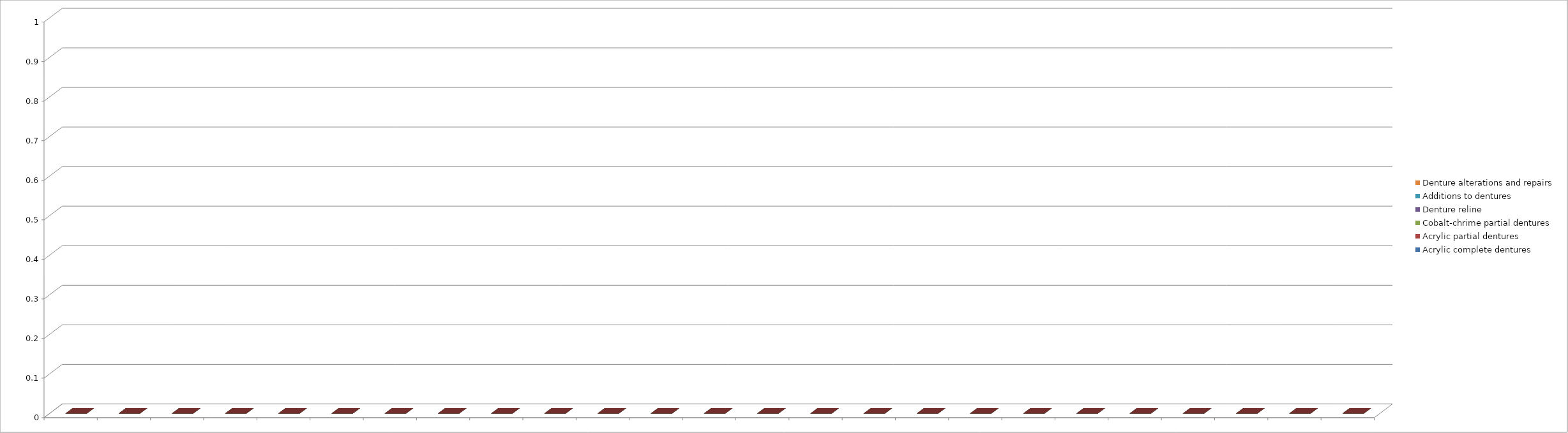
| Category | Acrylic complete dentures | Acrylic partial dentures | Cobalt-chrime partial dentures | Denture reline | Additions to dentures | Denture alterations and repairs |
|---|---|---|---|---|---|---|
| 0 | 0 | 0 | 0 | 0 | 0 | 0 |
| 1 | 0 | 0 | 0 | 0 | 0 | 0 |
| 2 | 0 | 0 | 0 | 0 | 0 | 0 |
| 3 | 0 | 0 | 0 | 0 | 0 | 0 |
| 4 | 0 | 0 | 0 | 0 | 0 | 0 |
| 5 | 0 | 0 | 0 | 0 | 0 | 0 |
| 6 | 0 | 0 | 0 | 0 | 0 | 0 |
| 7 | 0 | 0 | 0 | 0 | 0 | 0 |
| 8 | 0 | 0 | 0 | 0 | 0 | 0 |
| 9 | 0 | 0 | 0 | 0 | 0 | 0 |
| 10 | 0 | 0 | 0 | 0 | 0 | 0 |
| 11 | 0 | 0 | 0 | 0 | 0 | 0 |
| 12 | 0 | 0 | 0 | 0 | 0 | 0 |
| 13 | 0 | 0 | 0 | 0 | 0 | 0 |
| 14 | 0 | 0 | 0 | 0 | 0 | 0 |
| 15 | 0 | 0 | 0 | 0 | 0 | 0 |
| 16 | 0 | 0 | 0 | 0 | 0 | 0 |
| 17 | 0 | 0 | 0 | 0 | 0 | 0 |
| 18 | 0 | 0 | 0 | 0 | 0 | 0 |
| 19 | 0 | 0 | 0 | 0 | 0 | 0 |
| 20 | 0 | 0 | 0 | 0 | 0 | 0 |
| 21 | 0 | 0 | 0 | 0 | 0 | 0 |
| 22 | 0 | 0 | 0 | 0 | 0 | 0 |
| 23 | 0 | 0 | 0 | 0 | 0 | 0 |
| 24 | 0 | 0 | 0 | 0 | 0 | 0 |